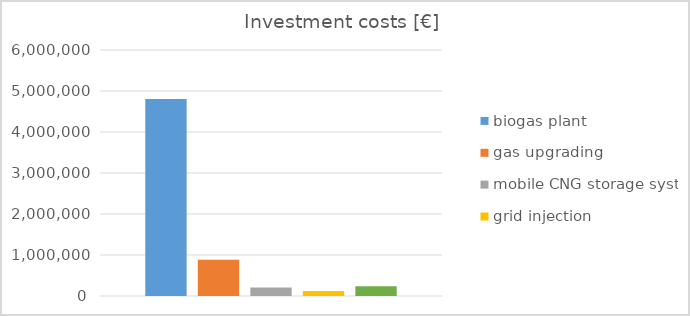
| Category | biogas plant | gas upgrading | mobile CNG storage systems | grid injection | filling station |
|---|---|---|---|---|---|
| 0 | 4803799.725 | 881399.326 | 210000 | 122000 | 237000 |